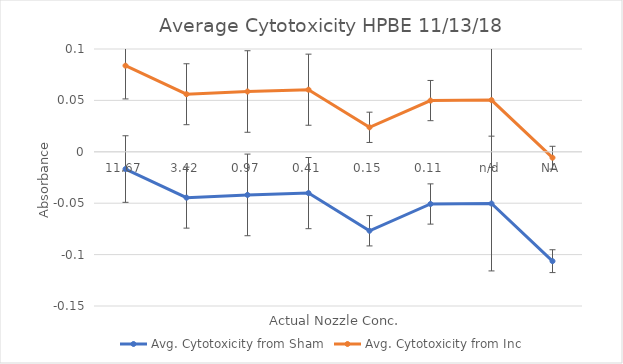
| Category | Avg. Cytotoxicity from Sham | Avg. Cytotoxicity from Inc |
|---|---|---|
| 11.67 | -0.017 | 0.084 |
| 3.42 | -0.045 | 0.056 |
| 0.97 | -0.042 | 0.059 |
| 0.41 | -0.04 | 0.06 |
| 0.15 | -0.077 | 0.024 |
| 0.11 | -0.051 | 0.05 |
| n/d | -0.05 | 0.05 |
| NA | -0.106 | -0.006 |